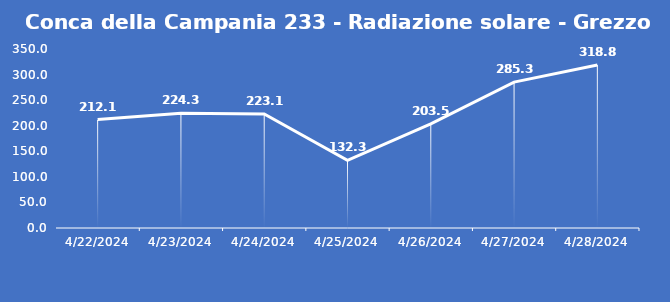
| Category | Conca della Campania 233 - Radiazione solare - Grezzo (W/m2) |
|---|---|
| 4/22/24 | 212.1 |
| 4/23/24 | 224.3 |
| 4/24/24 | 223.1 |
| 4/25/24 | 132.3 |
| 4/26/24 | 203.5 |
| 4/27/24 | 285.3 |
| 4/28/24 | 318.8 |